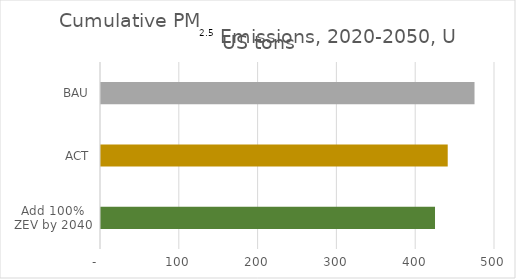
| Category | Cumulative PM2.5 Emissions, 2020-2050, US tons |
|---|---|
| Add 100% ZEV by 2040 | 423.872 |
| ACT | 440 |
| BAU | 474 |